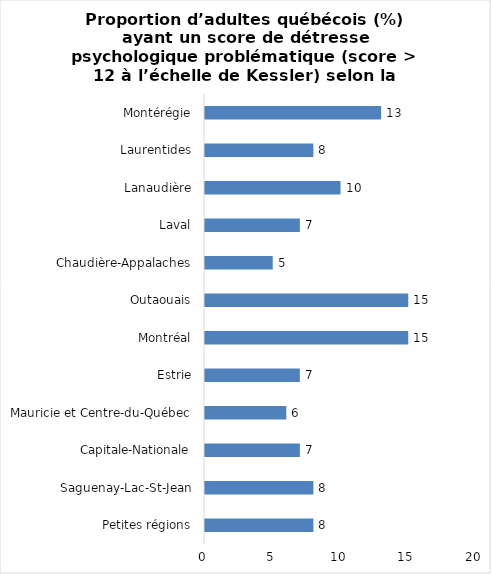
| Category | Series 0 |
|---|---|
| Petites régions | 8 |
| Saguenay-Lac-St-Jean | 8 |
| Capitale-Nationale | 7 |
| Mauricie et Centre-du-Québec | 6 |
| Estrie | 7 |
| Montréal | 15 |
| Outaouais | 15 |
| Chaudière-Appalaches | 5 |
| Laval | 7 |
| Lanaudière | 10 |
| Laurentides | 8 |
| Montérégie | 13 |